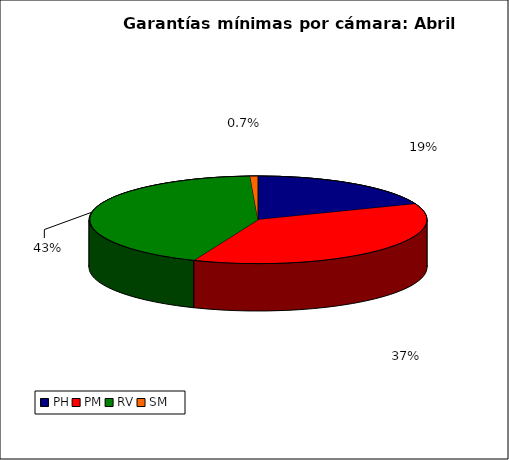
| Category | Series 0 |
|---|---|
| PH | 2075.784 |
| PM | 4040.319 |
| RV | 4685.419 |
| SM | 81.162 |